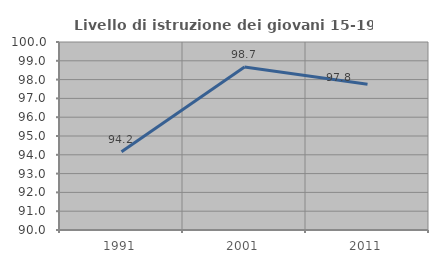
| Category | Livello di istruzione dei giovani 15-19 anni |
|---|---|
| 1991.0 | 94.167 |
| 2001.0 | 98.667 |
| 2011.0 | 97.753 |